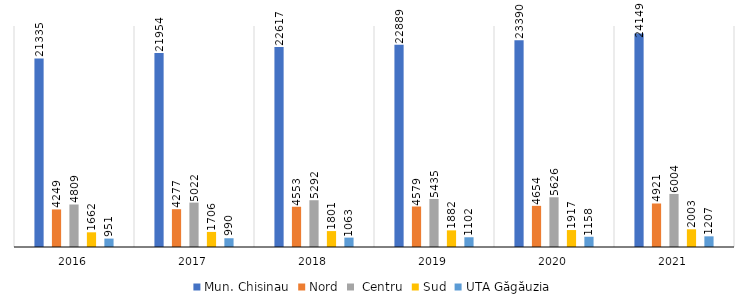
| Category | Mun. Chisinau | Nord |  Centru | Sud | UTA Găgăuzia |
|---|---|---|---|---|---|
| 2016.0 | 21335 | 4249 | 4809 | 1662 | 951 |
| 2017.0 | 21954 | 4277 | 5022 | 1706 | 990 |
| 2018.0 | 22617 | 4553 | 5292 | 1801 | 1063 |
| 2019.0 | 22889 | 4579 | 5435 | 1882 | 1102 |
| 2020.0 | 23390 | 4654 | 5626 | 1917 | 1158 |
| 2021.0 | 24149 | 4921 | 6004 | 2003 | 1207 |